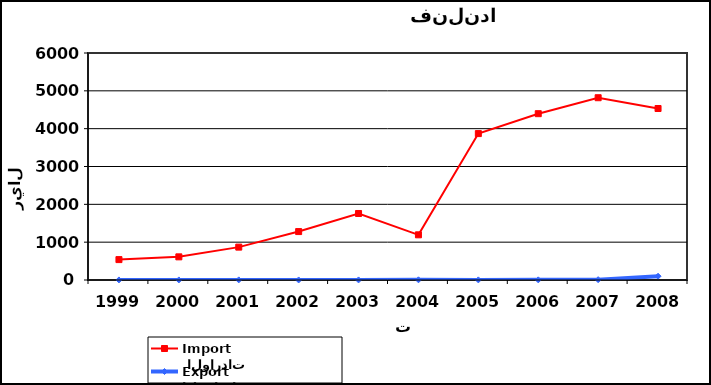
| Category |  الواردات           Import | الصادرات          Export |
|---|---|---|
| 1999.0 | 539 | 2 |
| 2000.0 | 612 | 2 |
| 2001.0 | 869 | 3 |
| 2002.0 | 1280 | 1 |
| 2003.0 | 1758 | 2 |
| 2004.0 | 1194 | 5 |
| 2005.0 | 3870 | 3 |
| 2006.0 | 4396 | 4 |
| 2007.0 | 4818 | 9 |
| 2008.0 | 4533 | 100 |